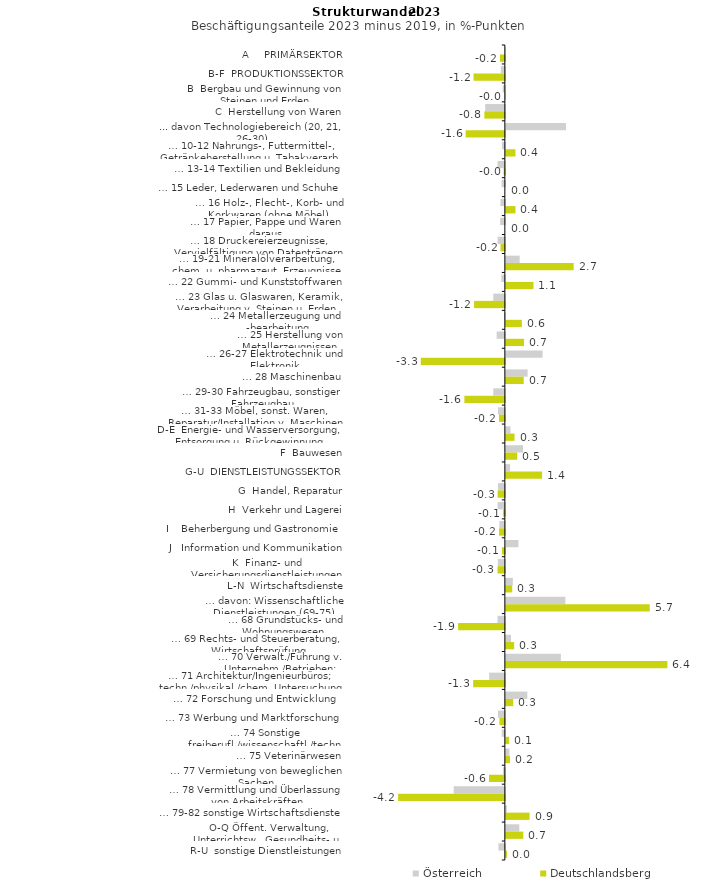
| Category | Österreich | Deutschlandsberg |
|---|---|---|
| A     PRIMÄRSEKTOR | -0.007 | -0.196 |
| B-F  PRODUKTIONSSEKTOR | -0.161 | -1.246 |
| B  Bergbau und Gewinnung von Steinen und Erden | -0.086 | -0.001 |
| C  Herstellung von Waren | -0.782 | -0.815 |
| ... davon Technologiebereich (20, 21, 26-30) | 2.393 | -1.559 |
| … 10-12 Nahrungs-, Futtermittel-, Getränkeherstellung u. Tabakverarb. | -0.116 | 0.383 |
| … 13-14 Textilien und Bekleidung | -0.289 | -0.049 |
| … 15 Leder, Lederwaren und Schuhe | -0.13 | 0 |
| … 16 Holz-, Flecht-, Korb- und Korkwaren (ohne Möbel)  | -0.177 | 0.383 |
| … 17 Papier, Pappe und Waren daraus  | -0.185 | 0 |
| … 18 Druckereierzeugnisse, Vervielfältigung von Datenträgern | -0.288 | -0.173 |
| … 19-21 Mineralölverarbeitung, chem. u. pharmazeut. Erzeugnisse | 0.549 | 2.697 |
| … 22 Gummi- und Kunststoffwaren | -0.139 | 1.098 |
| … 23 Glas u. Glaswaren, Keramik, Verarbeitung v. Steinen u. Erden  | -0.462 | -1.224 |
| … 24 Metallerzeugung und -bearbeitung | -0.032 | 0.638 |
| … 25 Herstellung von Metallerzeugnissen  | -0.325 | 0.724 |
| … 26-27 Elektrotechnik und Elektronik | 1.462 | -3.345 |
| … 28 Maschinenbau | 0.864 | 0.711 |
| … 29-30 Fahrzeugbau, sonstiger Fahrzeugbau | -0.462 | -1.61 |
| … 31-33 Möbel, sonst. Waren, Reparatur/Installation v. Maschinen | -0.273 | -0.234 |
| D-E  Energie- und Wasserversorgung, Entsorgung u. Rückgewinnung | 0.184 | 0.345 |
| F  Bauwesen | 0.684 | 0.451 |
| G-U  DIENSTLEISTUNGSSEKTOR | 0.167 | 1.441 |
| G  Handel, Reparatur | -0.273 | -0.29 |
| H  Verkehr und Lagerei | -0.287 | -0.072 |
| I    Beherbergung und Gastronomie | -0.218 | -0.23 |
| J   Information und Kommunikation | 0.499 | -0.118 |
| K  Finanz- und Versicherungsdienstleistungen | -0.279 | -0.293 |
| L-N  Wirtschaftsdienste | 0.279 | 0.253 |
| … davon: Wissenschaftliche Dienstleistungen (69-75) | 2.367 | 5.723 |
| … 68 Grundstücks- und Wohnungswesen  | -0.294 | -1.859 |
| … 69 Rechts- und Steuerberatung, Wirtschaftsprüfung | 0.205 | 0.33 |
| … 70 Verwalt./Führung v. Unternehm./Betrieben; Unternehmensberat. | 2.188 | 6.426 |
| … 71 Architektur/Ingenieurbüros; techn./physikal./chem. Untersuchung | -0.622 | -1.261 |
| … 72 Forschung und Entwicklung  | 0.854 | 0.293 |
| … 73 Werbung und Marktforschung | -0.273 | -0.216 |
| … 74 Sonstige freiberufl./wissenschaftl./techn. Tätigkeiten | -0.124 | 0.129 |
| … 75 Veterinärwesen | 0.14 | 0.165 |
| … 77 Vermietung von beweglichen Sachen  | -0.077 | -0.63 |
| … 78 Vermittlung und Überlassung von Arbeitskräften | -2.035 | -4.246 |
| … 79-82 sonstige Wirtschaftsdienste | 0.039 | 0.944 |
| O-Q Öffent. Verwaltung, Unterrichtsw., Gesundheits- u. Sozialwesen | 0.535 | 0.695 |
| R-U  sonstige Dienstleistungen | -0.256 | 0.043 |